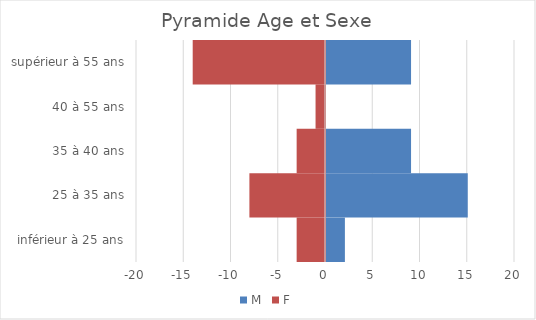
| Category | M | F |
|---|---|---|
| inférieur à 25 ans | 2 | -3 |
| 25 à 35 ans | 15 | -8 |
| 35 à 40 ans | 9 | -3 |
| 40 à 55 ans | 0 | -1 |
| supérieur à 55 ans | 9 | -14 |